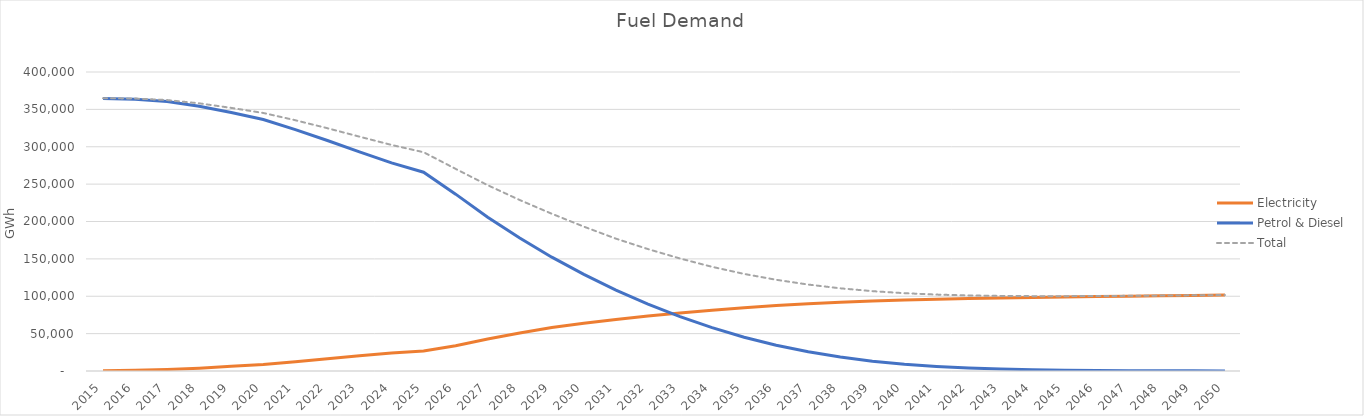
| Category | Electricity | Petrol & Diesel | Total |
|---|---|---|---|
| 2015.0 | 374.27 | 364560.953 | 364935.223 |
| 2016.0 | 919.976 | 363617.855 | 364537.831 |
| 2017.0 | 1987.365 | 360471.916 | 362459.281 |
| 2018.0 | 3836.359 | 354236.622 | 358072.981 |
| 2019.0 | 6295.099 | 345694.442 | 351989.541 |
| 2020.0 | 8791.747 | 336373.706 | 345165.453 |
| 2021.0 | 12518.175 | 322959.578 | 335477.753 |
| 2022.0 | 16473.042 | 308309.115 | 324782.157 |
| 2023.0 | 20322.676 | 293179.755 | 313502.431 |
| 2024.0 | 24023.626 | 278376.15 | 302399.776 |
| 2025.0 | 26761.394 | 265921.486 | 292682.88 |
| 2026.0 | 33783.819 | 236603.29 | 270387.109 |
| 2027.0 | 42767.719 | 205802.347 | 248570.066 |
| 2028.0 | 50748.524 | 177972.504 | 228721.028 |
| 2029.0 | 58102.14 | 152252.516 | 210354.656 |
| 2030.0 | 63866.14 | 129249.351 | 193115.491 |
| 2031.0 | 68946.29 | 108108.015 | 177054.305 |
| 2032.0 | 73559.38 | 89532.671 | 163092.051 |
| 2033.0 | 77676.01 | 72830.494 | 150506.504 |
| 2034.0 | 81358.45 | 58012.923 | 139371.373 |
| 2035.0 | 84642.66 | 45214.384 | 129857.044 |
| 2036.0 | 87520.932 | 34518.838 | 122039.77 |
| 2037.0 | 89943.689 | 25676.794 | 115620.483 |
| 2038.0 | 92001.093 | 18610.223 | 110611.316 |
| 2039.0 | 93658.59 | 13160.683 | 106819.273 |
| 2040.0 | 95004.576 | 9083.911 | 104088.487 |
| 2041.0 | 96116.988 | 6111.791 | 102228.779 |
| 2042.0 | 97027.682 | 4037.735 | 101065.417 |
| 2043.0 | 97794.882 | 2628.558 | 100423.44 |
| 2044.0 | 98468.286 | 1690.607 | 100158.892 |
| 2045.0 | 99054.592 | 1078.446 | 100133.037 |
| 2046.0 | 99601.829 | 684.388 | 100286.217 |
| 2047.0 | 100119.065 | 432.277 | 100551.343 |
| 2048.0 | 100598.898 | 272.551 | 100871.45 |
| 2049.0 | 101067.72 | 171.748 | 101239.468 |
| 2050.0 | 101528.732 | 107.965 | 101636.697 |